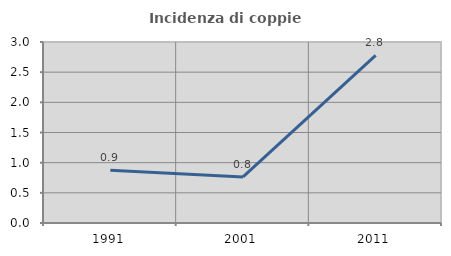
| Category | Incidenza di coppie miste |
|---|---|
| 1991.0 | 0.873 |
| 2001.0 | 0.763 |
| 2011.0 | 2.778 |